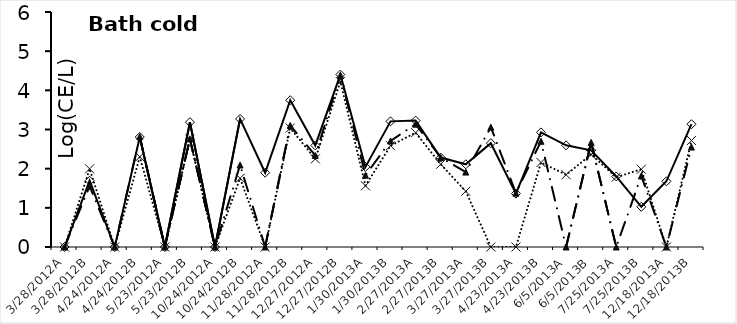
| Category | Legionella  | rtxA  | P65/66  |
|---|---|---|---|
| 3/28/2012A | 0 | 0 | 0 |
| 3/28/2012B | 1.693 | 1.552 | 1.996 |
| 4/24/2012A | 0 | 0 | 0 |
| 4/24/2012B | 2.809 | 2.818 | 2.302 |
| 5/23/2012A | 0 | 0 | 0 |
| 5/23/2012B | 3.187 | 2.761 | 2.754 |
| 10/24/2012A | 0 | 0 | 0 |
| 10/24/2012B | 3.27 | 2.093 | 1.755 |
| 11/28/2012A | 1.897 | 0 | 0 |
| 11/28/2012B | 3.748 | 3.104 | 3.036 |
| 12/27/2012A | 2.593 | 2.338 | 2.248 |
| 12/27/2012B | 4.403 | 4.388 | 4.223 |
| 1/30/2013A | 2.045 | 1.831 | 1.564 |
| 1/30/2013B | 3.207 | 2.708 | 2.586 |
| 2/27/2013A | 3.227 | 3.136 | 2.919 |
| 2/27/2013B | 2.283 | 2.286 | 2.114 |
| 3/27/2013A | 2.111 | 1.913 | 1.422 |
| 3/27/2013B | 2.65 | 3.059 | 0 |
| 4/23/2013A | 1.363 | 1.375 | 0 |
| 4/23/2013B | 2.926 | 2.699 | 2.157 |
| 6/5/2013A | 2.596 | 0 | 1.845 |
| 6/5/2013B | 2.468 | 2.67 | 2.363 |
| 7/25/2013A | 1.8 | 0 | 1.781 |
| 7/25/2013B | 1.026 | 1.817 | 1.985 |
| 12/18/2013A | 1.678 | 0 | 0 |
| 12/18/2013B | 3.135 | 2.552 | 2.72 |